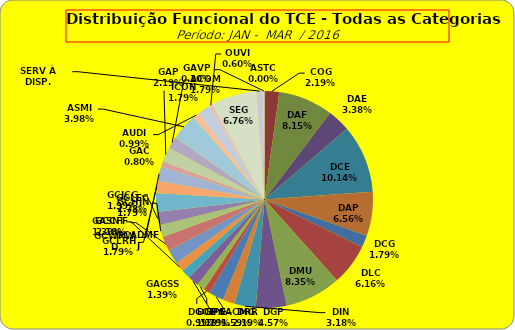
| Category | ASTC |
|---|---|
| ASTC | 0 |
| COG | 11 |
| DAF | 41 |
| DAE | 17 |
| DCE | 51 |
| DAP | 33 |
| DCG | 9 |
| DLC | 31 |
| DMU | 42 |
| DGP | 23 |
| DIN | 16 |
| DPE | 9 |
| DRR | 11 |
| DGCE | 5 |
| DGPA | 6 |
| GACMG | 8 |
| GAGSS | 7 |
| GASNI | 7 |
| GCADMFJ | 11 |
| GCCFF | 11 |
| GCHJN | 9 |
| GCJCG | 10 |
| GCLEC | 14 |
| GCLRH | 9 |
| GCWRWD | 11 |
| GAC | 4 |
| GAP | 11 |
| ACOM | 9 |
| ASMI | 20 |
| AUDI | 5 |
| ICON | 9 |
| OUVI | 3 |
| SEG | 34 |
| SERV À DISP. | 5 |
| GAVP | 1 |